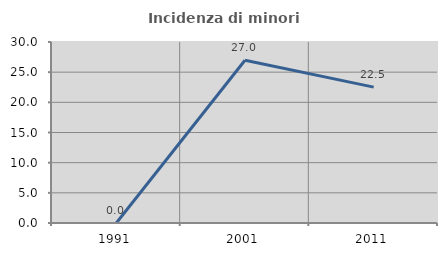
| Category | Incidenza di minori stranieri |
|---|---|
| 1991.0 | 0 |
| 2001.0 | 26.984 |
| 2011.0 | 22.517 |